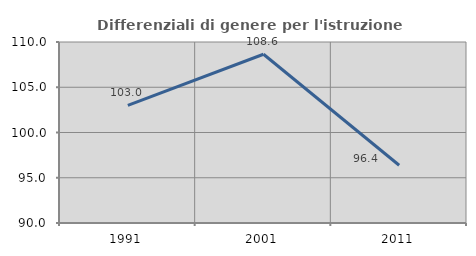
| Category | Differenziali di genere per l'istruzione superiore |
|---|---|
| 1991.0 | 103.005 |
| 2001.0 | 108.648 |
| 2011.0 | 96.379 |